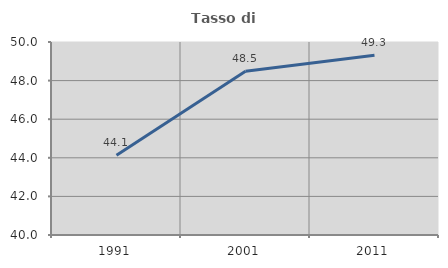
| Category | Tasso di occupazione   |
|---|---|
| 1991.0 | 44.135 |
| 2001.0 | 48.49 |
| 2011.0 | 49.319 |